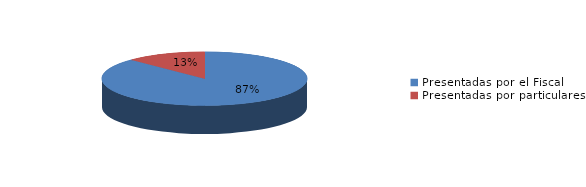
| Category | Series 0 |
|---|---|
| Presentadas por el Fiscal | 361 |
| Presentadas por particulares | 52 |